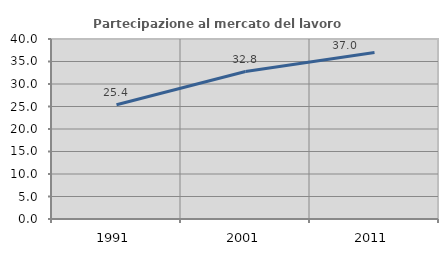
| Category | Partecipazione al mercato del lavoro  femminile |
|---|---|
| 1991.0 | 25.379 |
| 2001.0 | 32.773 |
| 2011.0 | 36.996 |